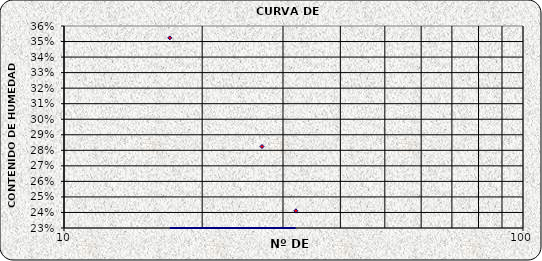
| Category | Series 0 |
|---|---|
| 32.0 | 0.241 |
| 27.0 | 0.282 |
| 17.0 | 0.352 |